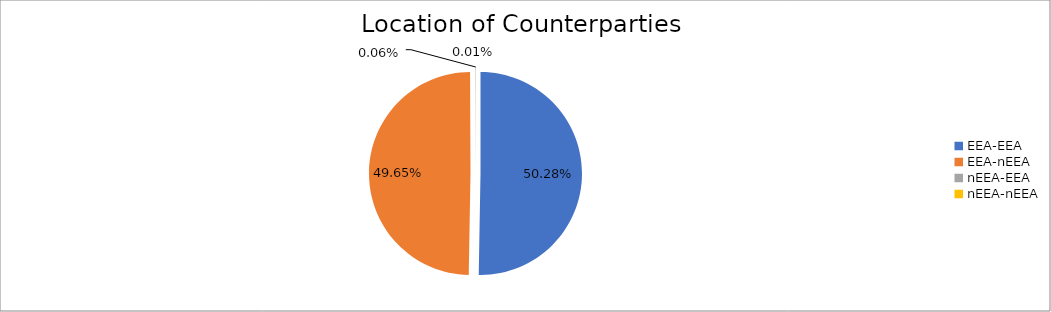
| Category | Series 0 |
|---|---|
| EEA-EEA | 6710308.833 |
| EEA-nEEA | 6627301.762 |
| nEEA-EEA | 7567.075 |
| nEEA-nEEA | 1695.693 |